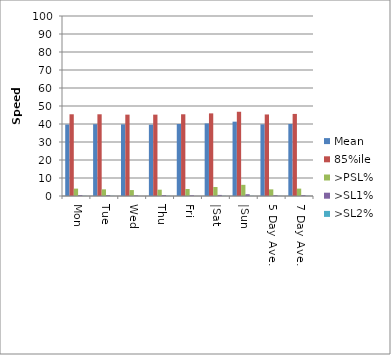
| Category | Mean | 85%ile | >PSL% | >SL1% | >SL2% |
|---|---|---|---|---|---|
| Mon | 39.7 | 45.4 | 4.1 | 0.5 | 0.1 |
| Tue | 39.9 | 45.4 | 3.7 | 0.5 | 0.1 |
| Wed | 39.8 | 45.2 | 3.3 | 0.3 | 0 |
| Thu | 39.6 | 45.2 | 3.5 | 0.5 | 0.1 |
| Fri | 40 | 45.4 | 3.9 | 0.4 | 0 |
| |Sat | 40.3 | 45.9 | 5 | 0.6 | 0.1 |
| |Sun | 41.3 | 46.8 | 6.2 | 1 | 0.1 |
| 5 Day Ave. | 39.8 | 45.3 | 3.689 | 0.425 | 0.06 |
| 7 Day Ave. | 40 | 45.6 | 4.1 | 0.5 | 0.1 |